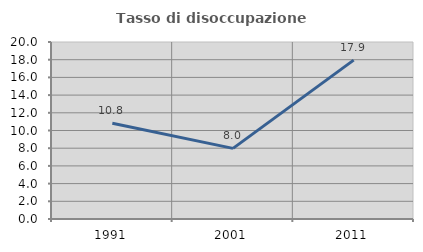
| Category | Tasso di disoccupazione giovanile  |
|---|---|
| 1991.0 | 10.811 |
| 2001.0 | 7.979 |
| 2011.0 | 17.949 |